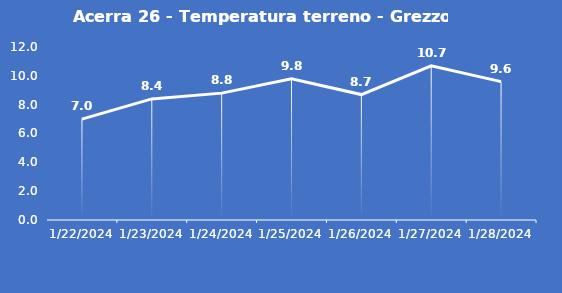
| Category | Acerra 26 - Temperatura terreno - Grezzo (°C) |
|---|---|
| 1/22/24 | 7 |
| 1/23/24 | 8.4 |
| 1/24/24 | 8.8 |
| 1/25/24 | 9.8 |
| 1/26/24 | 8.7 |
| 1/27/24 | 10.7 |
| 1/28/24 | 9.6 |